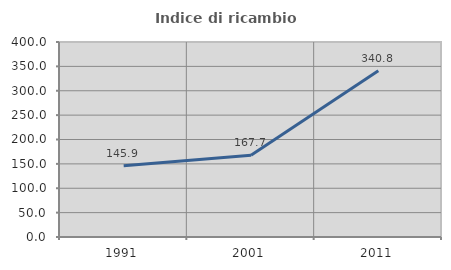
| Category | Indice di ricambio occupazionale  |
|---|---|
| 1991.0 | 145.918 |
| 2001.0 | 167.692 |
| 2011.0 | 340.816 |